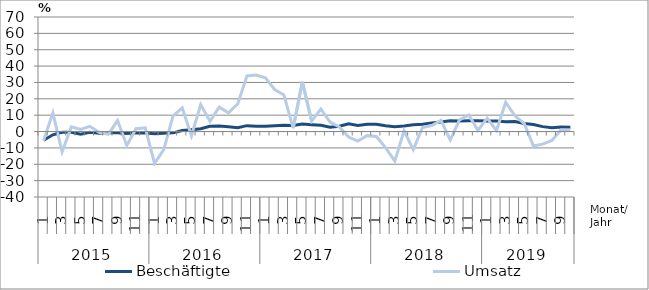
| Category | Beschäftigte | Umsatz |
|---|---|---|
| 0 | -5.3 | -5.5 |
| 1 | -2 | 11.4 |
| 2 | -0.5 | -12.4 |
| 3 | -0.5 | 2.9 |
| 4 | -1.7 | 1.3 |
| 5 | -0.5 | 3.2 |
| 6 | -1.1 | -0.5 |
| 7 | -0.8 | -1.7 |
| 8 | -0.7 | 6.7 |
| 9 | -1.2 | -8.5 |
| 10 | -0.7 | 1.7 |
| 11 | -0.9 | 2.3 |
| 12 | -1.3 | -19.4 |
| 13 | -1.1 | -11 |
| 14 | -0.8 | 9.4 |
| 15 | 0.6 | 14.4 |
| 16 | 1.1 | -2.6 |
| 17 | 1.7 | 16.5 |
| 18 | 3.2 | 6.3 |
| 19 | 3.4 | 14.9 |
| 20 | 3 | 11.4 |
| 21 | 2.4 | 16.9 |
| 22 | 3.6 | 34 |
| 23 | 3.2 | 34.5 |
| 24 | 3.3 | 32.8 |
| 25 | 3.6 | 25.7 |
| 26 | 3.9 | 22.4 |
| 27 | 3.7 | 2.1 |
| 28 | 4.6 | 30.4 |
| 29 | 4.2 | 6.4 |
| 30 | 3.8 | 13.7 |
| 31 | 2.7 | 5.8 |
| 32 | 3.3 | 2.8 |
| 33 | 4.7 | -3.4 |
| 34 | 3.7 | -5.8 |
| 35 | 4.4 | -2.5 |
| 36 | 4.5 | -3 |
| 37 | 3.6 | -9.8 |
| 38 | 2.9 | -18.1 |
| 39 | 3.4 | 0.5 |
| 40 | 4.2 | -11 |
| 41 | 4.5 | 2.5 |
| 42 | 5.3 | 3.7 |
| 43 | 5.8 | 6.8 |
| 44 | 6.6 | -5.2 |
| 45 | 6.5 | 7.1 |
| 46 | 6.6 | 10.1 |
| 47 | 6.6 | 0.8 |
| 48 | 6.4 | 8.2 |
| 49 | 6.5 | 0.6 |
| 50 | 6 | 17.8 |
| 51 | 6.1 | 9.6 |
| 52 | 4.9 | 4.9 |
| 53 | 4.3 | -8.8 |
| 54 | 3 | -7.7 |
| 55 | 2.3 | -5.4 |
| 56 | 2.8 | 1.1 |
| 57 | 2.6 | 1 |